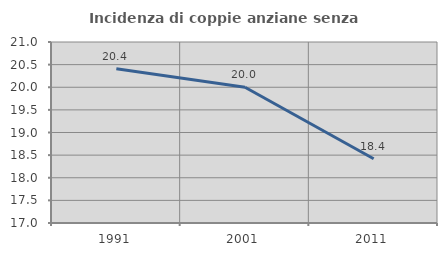
| Category | Incidenza di coppie anziane senza figli  |
|---|---|
| 1991.0 | 20.408 |
| 2001.0 | 20 |
| 2011.0 | 18.421 |